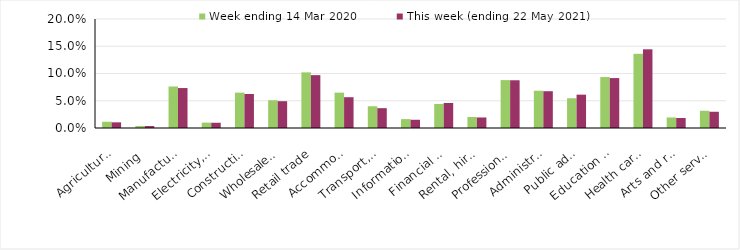
| Category | Week ending 14 Mar 2020 | This week (ending 22 May 2021) |
|---|---|---|
| Agriculture, forestry and fishing | 0.012 | 0.01 |
| Mining | 0.004 | 0.004 |
| Manufacturing | 0.076 | 0.073 |
| Electricity, gas, water and waste services | 0.01 | 0.01 |
| Construction | 0.065 | 0.062 |
| Wholesale trade | 0.051 | 0.049 |
| Retail trade | 0.102 | 0.097 |
| Accommodation and food services | 0.065 | 0.056 |
| Transport, postal and warehousing | 0.04 | 0.036 |
| Information media and telecommunications | 0.016 | 0.015 |
| Financial and insurance services | 0.044 | 0.046 |
| Rental, hiring and real estate services | 0.02 | 0.019 |
| Professional, scientific and technical services | 0.088 | 0.088 |
| Administrative and support services | 0.068 | 0.068 |
| Public administration and safety | 0.055 | 0.061 |
| Education and training | 0.094 | 0.092 |
| Health care and social assistance | 0.136 | 0.144 |
| Arts and recreation services | 0.019 | 0.018 |
| Other services | 0.032 | 0.03 |